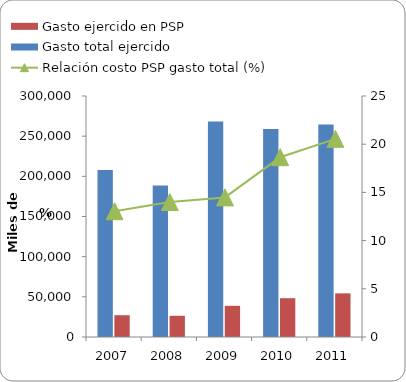
| Category | Gasto total ejercido | Gasto ejercido en PSP |
|---|---|---|
| 2007 | 207984 | 27131 |
| 2008 | 188677.7 | 26414 |
| 2009 | 268119 | 38826 |
| 2010 | 258863 | 48285 |
| 2011 | 264391.6 | 54346.26 |